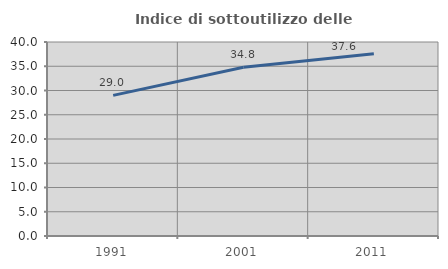
| Category | Indice di sottoutilizzo delle abitazioni  |
|---|---|
| 1991.0 | 28.997 |
| 2001.0 | 34.777 |
| 2011.0 | 37.568 |